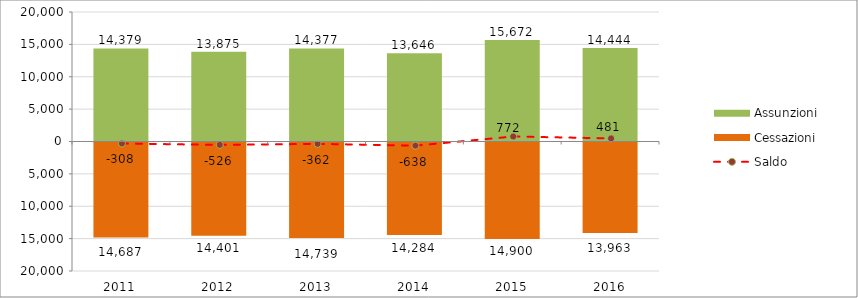
| Category | Assunzioni | Cessazioni |
|---|---|---|
| 2011.0 | 14379 | -14687 |
| 2012.0 | 13875 | -14401 |
| 2013.0 | 14377 | -14739 |
| 2014.0 | 13646 | -14284 |
| 2015.0 | 15672 | -14900 |
| 2016.0 | 14444 | -13963 |